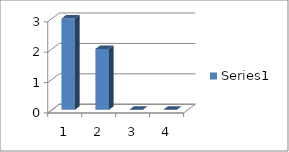
| Category | Series 0 |
|---|---|
| 0 | 3 |
| 1 | 2 |
| 2 | 0 |
| 3 | 0 |